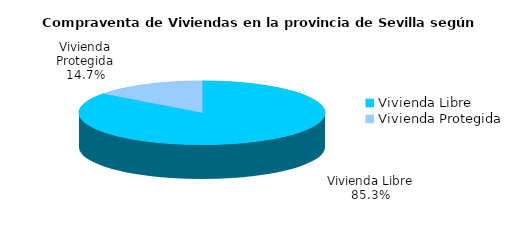
| Category | Series 0 | Series 1 |
|---|---|---|
| Vivienda Libre | 867 | 0.853 |
| Vivienda Protegida | 150 | 0.147 |